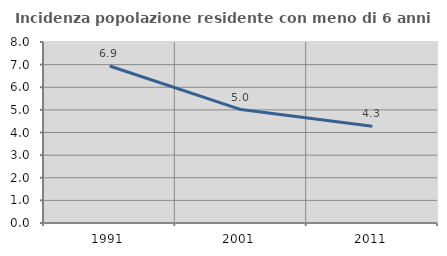
| Category | Incidenza popolazione residente con meno di 6 anni |
|---|---|
| 1991.0 | 6.94 |
| 2001.0 | 5.014 |
| 2011.0 | 4.277 |